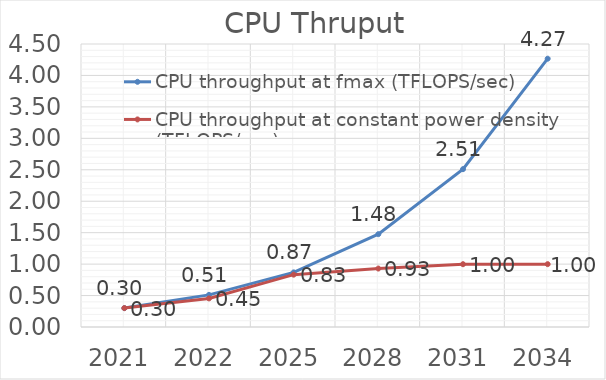
| Category | CPU throughput at fmax (TFLOPS/sec) | CPU throughput at constant power density (TFLOPS/sec) |
|---|---|---|
| 2021.0 | 0.3 | 0.3 |
| 2022.0 | 0.511 | 0.455 |
| 2025.0 | 0.868 | 0.832 |
| 2028.0 | 1.476 | 0.93 |
| 2031.0 | 2.51 | 0.998 |
| 2034.0 | 4.266 | 0.999 |